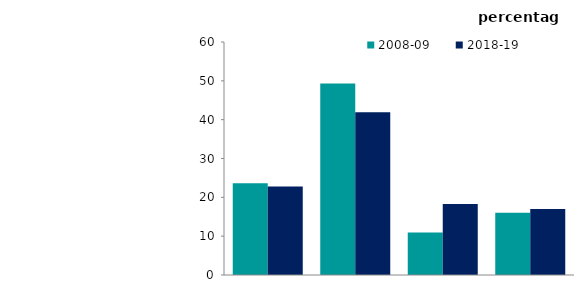
| Category | 2008-09 | 2018-19 |
|---|---|---|
| 0 | 23.651 | 22.804 |
| 1 | 49.343 | 41.906 |
| 2 | 10.976 | 18.293 |
| 3 | 16.03 | 16.996 |